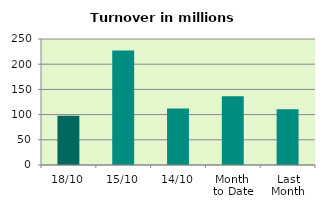
| Category | Series 0 |
|---|---|
| 18/10 | 97.85 |
| 15/10 | 227.089 |
| 14/10 | 112.241 |
| Month 
to Date | 136.33 |
| Last
Month | 110.611 |